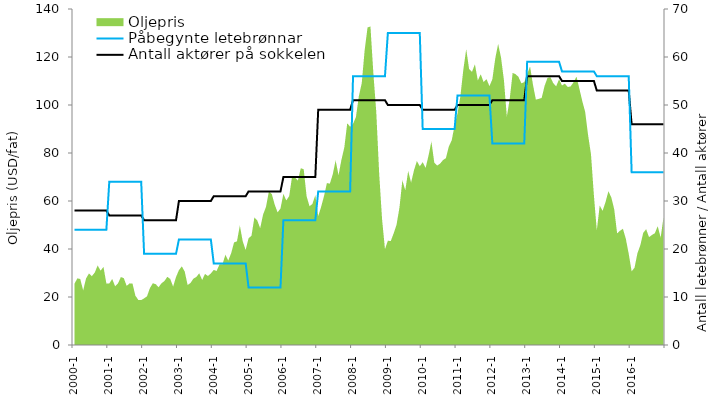
| Category | Antall aktører på sokkelen | Påbegynte letebrønnar |
|---|---|---|
| 2000-1 | 28 | 24 |
| 2000-2 | 28 | 24 |
| 2000-3 | 28 | 24 |
| 2000-4 | 28 | 24 |
| 2000-5 | 28 | 24 |
| 2000-6 | 28 | 24 |
| 2000-7 | 28 | 24 |
| 2000-8 | 28 | 24 |
| 2000-9 | 28 | 24 |
| 2000-10 | 28 | 24 |
| 2000-11 | 28 | 24 |
| 2000-12 | 28 | 24 |
| 2001-1 | 27 | 34 |
| 2001-2 | 27 | 34 |
| 2001-3 | 27 | 34 |
| 2001-4 | 27 | 34 |
| 2001-5 | 27 | 34 |
| 2001-6 | 27 | 34 |
| 2001-7 | 27 | 34 |
| 2001-8 | 27 | 34 |
| 2001-9 | 27 | 34 |
| 2001-10 | 27 | 34 |
| 2001-11 | 27 | 34 |
| 2001-12 | 27 | 34 |
| 2002-1 | 26 | 19 |
| 2002-2 | 26 | 19 |
| 2002-3 | 26 | 19 |
| 2002-4 | 26 | 19 |
| 2002-5 | 26 | 19 |
| 2002-6 | 26 | 19 |
| 2002-7 | 26 | 19 |
| 2002-8 | 26 | 19 |
| 2002-9 | 26 | 19 |
| 2002-10 | 26 | 19 |
| 2002-11 | 26 | 19 |
| 2002-12 | 26 | 19 |
| 2003-1 | 30 | 22 |
| 2003-2 | 30 | 22 |
| 2003-3 | 30 | 22 |
| 2003-4 | 30 | 22 |
| 2003-5 | 30 | 22 |
| 2003-6 | 30 | 22 |
| 2003-7 | 30 | 22 |
| 2003-8 | 30 | 22 |
| 2003-9 | 30 | 22 |
| 2003-10 | 30 | 22 |
| 2003-11 | 30 | 22 |
| 2003-12 | 30 | 22 |
| 2004-1 | 31 | 17 |
| 2004-2 | 31 | 17 |
| 2004-3 | 31 | 17 |
| 2004-4 | 31 | 17 |
| 2004-5 | 31 | 17 |
| 2004-6 | 31 | 17 |
| 2004-7 | 31 | 17 |
| 2004-8 | 31 | 17 |
| 2004-9 | 31 | 17 |
| 2004-10 | 31 | 17 |
| 2004-11 | 31 | 17 |
| 2004-12 | 31 | 17 |
| 2005-1 | 32 | 12 |
| 2005-2 | 32 | 12 |
| 2005-3 | 32 | 12 |
| 2005-4 | 32 | 12 |
| 2005-5 | 32 | 12 |
| 2005-6 | 32 | 12 |
| 2005-7 | 32 | 12 |
| 2005-8 | 32 | 12 |
| 2005-9 | 32 | 12 |
| 2005-10 | 32 | 12 |
| 2005-11 | 32 | 12 |
| 2005-12 | 32 | 12 |
| 2006-1 | 35 | 26 |
| 2006-2 | 35 | 26 |
| 2006-3 | 35 | 26 |
| 2006-4 | 35 | 26 |
| 2006-5 | 35 | 26 |
| 2006-6 | 35 | 26 |
| 2006-7 | 35 | 26 |
| 2006-8 | 35 | 26 |
| 2006-9 | 35 | 26 |
| 2006-10 | 35 | 26 |
| 2006-11 | 35 | 26 |
| 2006-12 | 35 | 26 |
| 2007-1 | 49 | 32 |
| 2007-2 | 49 | 32 |
| 2007-3 | 49 | 32 |
| 2007-4 | 49 | 32 |
| 2007-5 | 49 | 32 |
| 2007-6 | 49 | 32 |
| 2007-7 | 49 | 32 |
| 2007-8 | 49 | 32 |
| 2007-9 | 49 | 32 |
| 2007-10 | 49 | 32 |
| 2007-11 | 49 | 32 |
| 2007-12 | 49 | 32 |
| 2008-1 | 51 | 56 |
| 2008-2 | 51 | 56 |
| 2008-3 | 51 | 56 |
| 2008-4 | 51 | 56 |
| 2008-5 | 51 | 56 |
| 2008-6 | 51 | 56 |
| 2008-7 | 51 | 56 |
| 2008-8 | 51 | 56 |
| 2008-9 | 51 | 56 |
| 2008-10 | 51 | 56 |
| 2008-11 | 51 | 56 |
| 2008-12 | 51 | 56 |
| 2009-1 | 50 | 65 |
| 2009-2 | 50 | 65 |
| 2009-3 | 50 | 65 |
| 2009-4 | 50 | 65 |
| 2009-5 | 50 | 65 |
| 2009-6 | 50 | 65 |
| 2009-7 | 50 | 65 |
| 2009-8 | 50 | 65 |
| 2009-9 | 50 | 65 |
| 2009-10 | 50 | 65 |
| 2009-11 | 50 | 65 |
| 2009-12 | 50 | 65 |
| 2010-1 | 49 | 45 |
| 2010-2 | 49 | 45 |
| 2010-3 | 49 | 45 |
| 2010-4 | 49 | 45 |
| 2010-5 | 49 | 45 |
| 2010-6 | 49 | 45 |
| 2010-7 | 49 | 45 |
| 2010-8 | 49 | 45 |
| 2010-9 | 49 | 45 |
| 2010-10 | 49 | 45 |
| 2010-11 | 49 | 45 |
| 2010-12 | 49 | 45 |
| 2011-1 | 50 | 52 |
| 2011-2 | 50 | 52 |
| 2011-3 | 50 | 52 |
| 2011-4 | 50 | 52 |
| 2011-5 | 50 | 52 |
| 2011-6 | 50 | 52 |
| 2011-7 | 50 | 52 |
| 2011-8 | 50 | 52 |
| 2011-9 | 50 | 52 |
| 2011-10 | 50 | 52 |
| 2011-11 | 50 | 52 |
| 2011-12 | 50 | 52 |
| 2012-1 | 51 | 42 |
| 2012-2 | 51 | 42 |
| 2012-3 | 51 | 42 |
| 2012-4 | 51 | 42 |
| 2012-5 | 51 | 42 |
| 2012-6 | 51 | 42 |
| 2012-7 | 51 | 42 |
| 2012-8 | 51 | 42 |
| 2012-9 | 51 | 42 |
| 2012-10 | 51 | 42 |
| 2012-11 | 51 | 42 |
| 2012-12 | 51 | 42 |
| 2013-1 | 56 | 59 |
| 2013-2 | 56 | 59 |
| 2013-3 | 56 | 59 |
| 2013-4 | 56 | 59 |
| 2013-5 | 56 | 59 |
| 2013-6 | 56 | 59 |
| 2013-7 | 56 | 59 |
| 2013-8 | 56 | 59 |
| 2013-9 | 56 | 59 |
| 2013-10 | 56 | 59 |
| 2013-11 | 56 | 59 |
| 2013-12 | 56 | 59 |
| 2014-1 | 55 | 57 |
| 2014-2 | 55 | 57 |
| 2014-3 | 55 | 57 |
| 2014-4 | 55 | 57 |
| 2014-5 | 55 | 57 |
| 2014-6 | 55 | 57 |
| 2014-7 | 55 | 57 |
| 2014-8 | 55 | 57 |
| 2014-9 | 55 | 57 |
| 2014-10 | 55 | 57 |
| 2014-11 | 55 | 57 |
| 2014-12 | 55 | 57 |
| 2015-1 | 53 | 56 |
| 2015-2 | 53 | 56 |
| 2015-3 | 53 | 56 |
| 2015-4 | 53 | 56 |
| 2015-5 | 53 | 56 |
| 2015-6 | 53 | 56 |
| 2015-7 | 53 | 56 |
| 2015-8 | 53 | 56 |
| 2015-9 | 53 | 56 |
| 2015-10 | 53 | 56 |
| 2015-11 | 53 | 56 |
| 2015-12 | 53 | 56 |
| 2016-1 | 46 | 36 |
| 2016-2 | 46 | 36 |
| 2016-3 | 46 | 36 |
| 2016-4 | 46 | 36 |
| 2016-5 | 46 | 36 |
| 2016-6 | 46 | 36 |
| 2016-7 | 46 | 36 |
| 2016-8 | 46 | 36 |
| 2016-9 | 46 | 36 |
| 2016-10 | 46 | 36 |
| 2016-11 | 46 | 36 |
| 2016-12 | 46 | 36 |